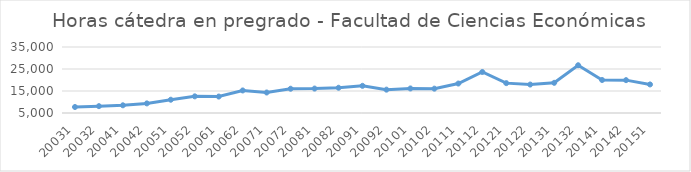
| Category | Total horas |
|---|---|
| 20031 | 7726 |
| 20032 | 8116 |
| 20041 | 8502 |
| 20042 | 9362 |
| 20051 | 11034 |
| 20052 | 12568 |
| 20061 | 12477 |
| 20062 | 15248 |
| 20071 | 14317 |
| 20072 | 16027 |
| 20081 | 16104 |
| 20082 | 16477 |
| 20091 | 17355 |
| 20092 | 15612 |
| 20101 | 16151 |
| 20102 | 16065 |
| 20111 | 18394 |
| 20112 | 23639 |
| 20121 | 18573 |
| 20122 | 17933 |
| 20131 | 18718 |
| 20132 | 26707 |
| 20141 | 19998 |
| 20142 | 19935 |
| 20151 | 17980 |